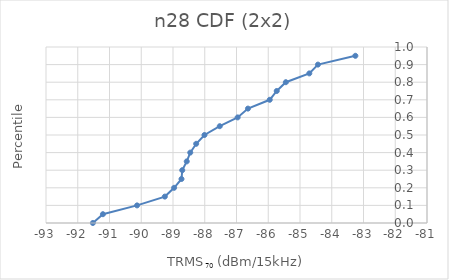
| Category | n28 |
|---|---|
| -91.52359522995921 | 0 |
| -91.20752705483594 | 0.05 |
| -90.13200729782974 | 0.1 |
| -89.25704911648681 | 0.15 |
| -88.96470593670193 | 0.2 |
| -88.73247008794567 | 0.25 |
| -88.70882838570674 | 0.3 |
| -88.56718430517253 | 0.35 |
| -88.45627034909148 | 0.4 |
| -88.26991650219715 | 0.45 |
| -88.00847559928506 | 0.5 |
| -87.52707552153713 | 0.55 |
| -86.96387449741464 | 0.6 |
| -86.63925613107851 | 0.65 |
| -85.95321729526844 | 0.7 |
| -85.73315785632082 | 0.75 |
| -85.44640370499631 | 0.8 |
| -84.70656215241497 | 0.85 |
| -84.43478341818386 | 0.9 |
| -83.25579629902448 | 0.95 |